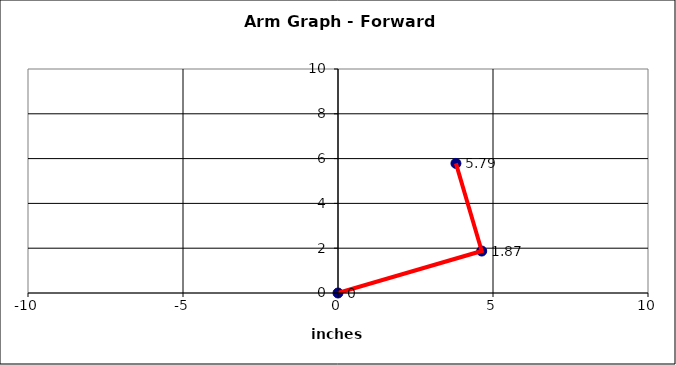
| Category | Series 0 |
|---|---|
| 0.0 | 0 |
| 4.635919272833937 | 1.873 |
| 3.8042725095629004 | 5.786 |